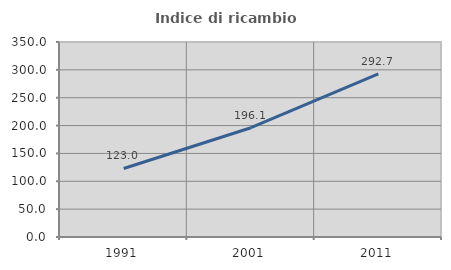
| Category | Indice di ricambio occupazionale  |
|---|---|
| 1991.0 | 123.02 |
| 2001.0 | 196.14 |
| 2011.0 | 292.664 |